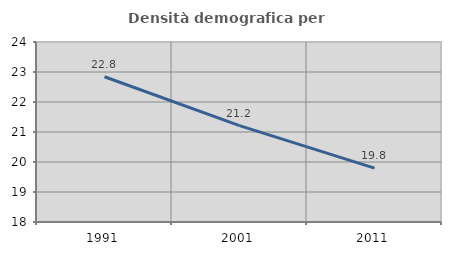
| Category | Densità demografica |
|---|---|
| 1991.0 | 22.842 |
| 2001.0 | 21.21 |
| 2011.0 | 19.796 |